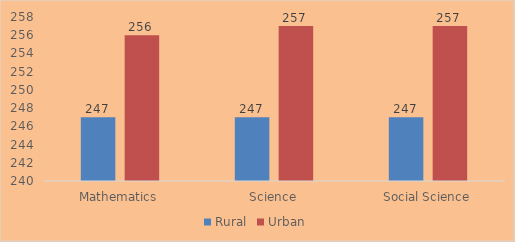
| Category | Rural | Urban |
|---|---|---|
| Mathematics | 247 | 256 |
| Science | 247 | 257 |
| Social Science | 247 | 257 |